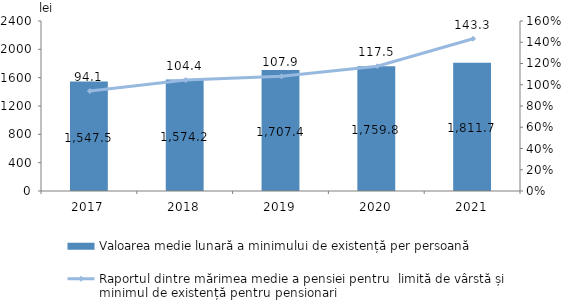
| Category | Valoarea medie lunară a minimului de existență per persoană |
|---|---|
| 2017.0 | 1547.5 |
| 2018.0 | 1574.2 |
| 2019.0 | 1707.4 |
| 2020.0 | 1759.8 |
| 2021.0 | 1811.7 |